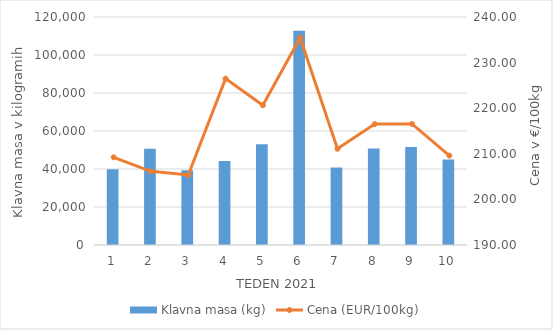
| Category | Klavna masa (kg) |
|---|---|
| 1.0 | 39814 |
| 2.0 | 50603 |
| 3.0 | 39295 |
| 4.0 | 44250 |
| 5.0 | 53061 |
| 6.0 | 112816 |
| 7.0 | 40829 |
| 8.0 | 50775 |
| 9.0 | 51535 |
| 10.0 | 45040 |